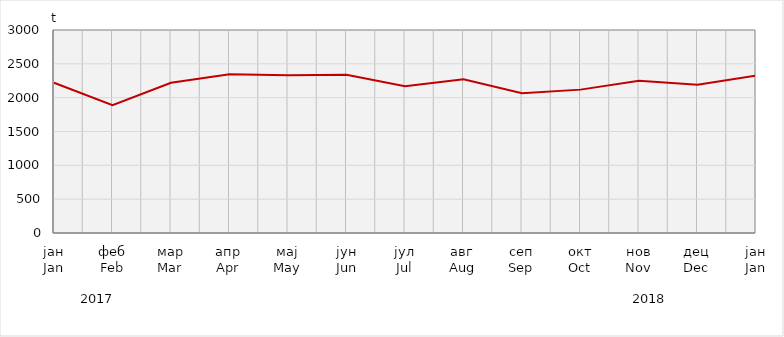
| Category | Нето тежина заклане стоке                              Net weight of  slaughtered livestock |
|---|---|
| јан
Jan | 2220030.9 |
| феб
Feb | 1890056.65 |
| мар
Mar | 2221281.4 |
| апр
Apr | 2344899.97 |
| мај
May | 2330965.85 |
| јун
Jun | 2337255.83 |
| јул
Jul | 2169976.6 |
| авг
Aug | 2273238.2 |
| сеп
Sep | 2066000 |
| окт
Oct | 2118775.52 |
| нов
Nov | 2248639.95 |
| дец
Dec | 2190874.83 |
| јан
Jan | 2324971.47 |